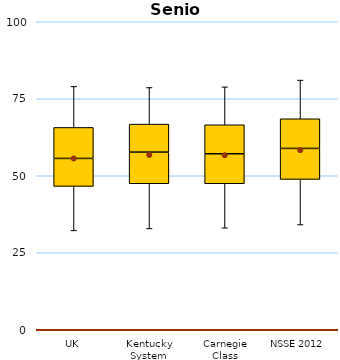
| Category | 25th | 50th | 75th |
|---|---|---|---|
| UK | 46.537 | 9.091 | 10.065 |
| Kentucky System | 47.403 | 10.281 | 9.091 |
| Carnegie Class | 47.403 | 9.74 | 9.416 |
| NSSE 2012 | 48.81 | 10.065 | 9.632 |